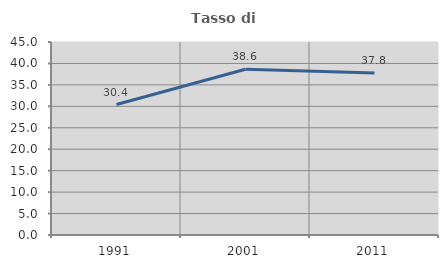
| Category | Tasso di occupazione   |
|---|---|
| 1991.0 | 30.423 |
| 2001.0 | 38.638 |
| 2011.0 | 37.779 |